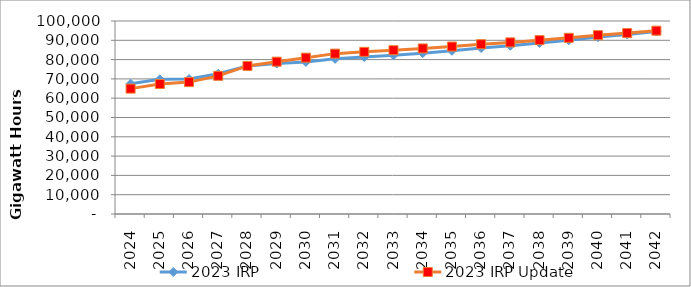
| Category | 2023 IRP | 2023 IRP Update |
|---|---|---|
| 2024.0 | 67499.27 | 64968.11 |
| 2025.0 | 69805.06 | 67342.93 |
| 2026.0 | 69938.42 | 68341.61 |
| 2027.0 | 72649.77 | 71581.93 |
| 2028.0 | 76681.12 | 76717.85 |
| 2029.0 | 77919.28 | 78931.21 |
| 2030.0 | 78811.84 | 81000.34 |
| 2031.0 | 80380.69 | 83090.03 |
| 2032.0 | 81321.78 | 84020.84 |
| 2033.0 | 82222.23 | 84868.04 |
| 2034.0 | 83351.54 | 85779.13 |
| 2035.0 | 84549.96 | 86764.37 |
| 2036.0 | 85984.85 | 87968.04 |
| 2037.0 | 87179.75 | 88920.97 |
| 2038.0 | 88585.25 | 90083.15 |
| 2039.0 | 90027.16 | 91291.27 |
| 2040.0 | 91644.11 | 92669.76 |
| 2041.0 | 92996.56 | 93733.98 |
| 2042.0 | 94591.13 | 94980.88 |